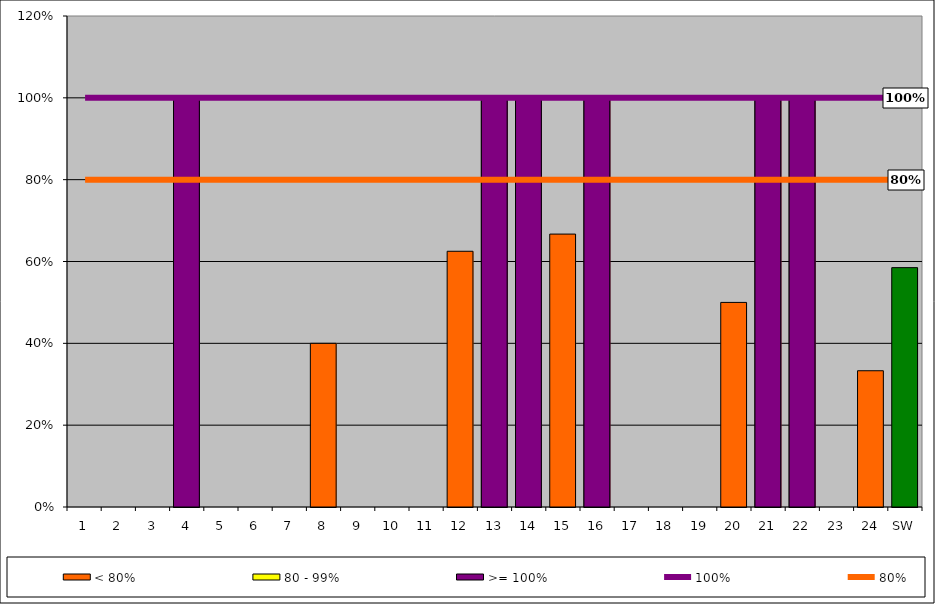
| Category | < 80% | 80 - 99% | >= 100% |
|---|---|---|---|
| 1 | 0 | 0 | 0 |
| 2 | 0 | 0 | 0 |
| 3 | 0 | 0 | 0 |
| 4 | 1 | 0 | 1 |
| 5 | 0 | 0 | 0 |
| 6 | 0 | 0 | 0 |
| 7 | 0 | 0 | 0 |
| 8 | 0.4 | 0 | 0 |
| 9 | 0 | 0 | 0 |
| 10 | 0 | 0 | 0 |
| 11 | 0 | 0 | 0 |
| 12 | 0.625 | 0 | 0 |
| 13 | 1 | 0 | 1 |
| 14 | 1 | 0 | 1 |
| 15 | 0.667 | 0 | 0 |
| 16 | 1 | 0 | 1 |
| 17 | 0 | 0 | 0 |
| 18 | 0 | 0 | 0 |
| 19 | 0 | 0 | 0 |
| 20 | 0.5 | 0 | 0 |
| 21 | 1 | 0 | 1 |
| 22 | 1 | 0 | 1 |
| 23 | 0 | 0 | 0 |
| 24 | 0.333 | 0 | 0 |
| SW | 0.585 | 0 | 0 |